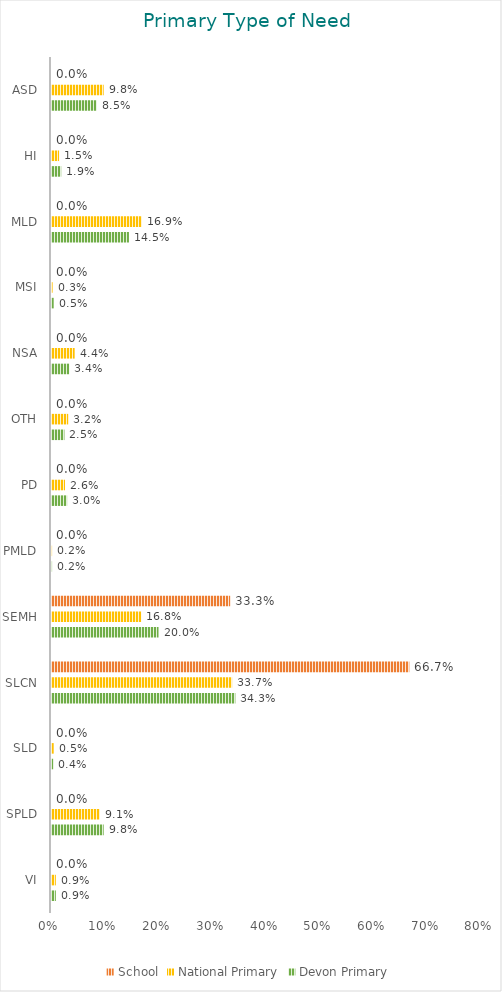
| Category | School | National Primary | Devon Primary |
|---|---|---|---|
| ASD | 0 | 0.098 | 0.085 |
| HI | 0 | 0.015 | 0.019 |
| MLD | 0 | 0.169 | 0.145 |
| MSI | 0 | 0.003 | 0.005 |
| NSA | 0 | 0.044 | 0.034 |
| OTH | 0 | 0.032 | 0.025 |
| PD | 0 | 0.026 | 0.03 |
| PMLD | 0 | 0.002 | 0.002 |
| SEMH | 0.333 | 0.168 | 0.2 |
| SLCN | 0.667 | 0.337 | 0.343 |
| SLD | 0 | 0.005 | 0.004 |
| SPLD | 0 | 0.091 | 0.098 |
| VI | 0 | 0.009 | 0.009 |